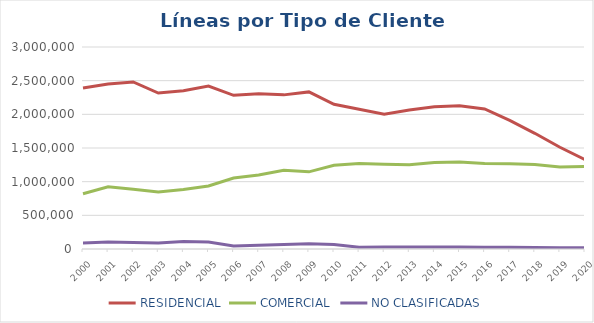
| Category | RESIDENCIAL | COMERCIAL | NO CLASIFICADAS |
|---|---|---|---|
| 2000.0 | 2391600.86 | 820134.14 | 90763 |
| 2001.0 | 2450631.958 | 924449.042 | 103411 |
| 2002.0 | 2481214 | 887657 | 98142 |
| 2003.0 | 2315980 | 846524 | 89559 |
| 2004.0 | 2350770.912 | 882812.088 | 111519 |
| 2005.0 | 2420710.597 | 936558.403 | 103376 |
| 2006.0 | 2282170 | 1055019 | 46408 |
| 2007.0 | 2304237 | 1099345 | 56029 |
| 2008.0 | 2289075 | 1169557 | 66158 |
| 2009.0 | 2332952 | 1145936 | 76423 |
| 2010.0 | 2149852 | 1244093 | 65422 |
| 2011.0 | 2076184 | 1267963 | 25957 |
| 2012.0 | 2003235 | 1257853 | 31414 |
| 2013.0 | 2064536 | 1252954 | 29741 |
| 2014.0 | 2113422 | 1284776 | 29551 |
| 2015.0 | 2126562 | 1291291 | 28027 |
| 2016.0 | 2079358 | 1270087 | 25592 |
| 2017.0 | 1909980 | 1265880 | 24385 |
| 2018.0 | 1718412 | 1256588 | 22192 |
| 2019.0 | 1511530 | 1219199 | 19543 |
| 2020.0 | 1326881 | 1223748 | 17309 |